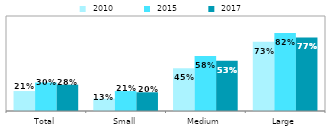
| Category |  2010 |  2015 |  2017 |
|---|---|---|---|
| Total | 0.21 | 0.3 | 0.277 |
| Small | 0.13 | 0.21 | 0.197 |
| Medium | 0.45 | 0.58 | 0.53 |
| Large | 0.73 | 0.82 | 0.774 |